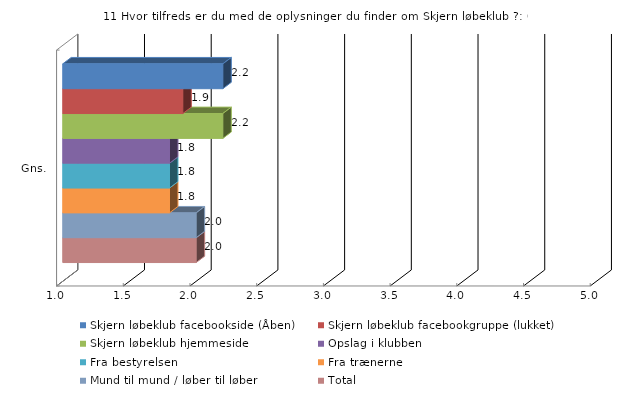
| Category | Skjern løbeklub facebookside (Åben) | Skjern løbeklub facebookgruppe (lukket) | Skjern løbeklub hjemmeside | Opslag i klubben | Fra bestyrelsen | Fra trænerne | Mund til mund / løber til løber | Total |
|---|---|---|---|---|---|---|---|---|
| Gns. | 2.2 | 1.9 | 2.2 | 1.8 | 1.8 | 1.8 | 2 | 2 |